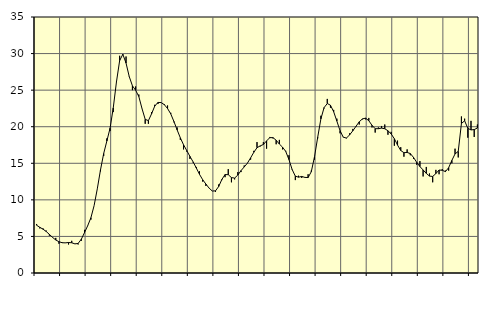
| Category | Piggar | Series 1 |
|---|---|---|
| nan | 6.7 | 6.53 |
| 87.0 | 6.1 | 6.25 |
| 87.0 | 6.1 | 5.99 |
| 87.0 | 5.8 | 5.68 |
| nan | 5.1 | 5.28 |
| 88.0 | 4.9 | 4.87 |
| 88.0 | 4.8 | 4.51 |
| 88.0 | 4 | 4.28 |
| nan | 4.2 | 4.14 |
| 89.0 | 4.1 | 4.12 |
| 89.0 | 3.9 | 4.17 |
| 89.0 | 4.4 | 4.13 |
| nan | 4 | 3.98 |
| 90.0 | 3.9 | 4.04 |
| 90.0 | 4.4 | 4.62 |
| 90.0 | 5.9 | 5.52 |
| nan | 6.5 | 6.47 |
| 91.0 | 7.3 | 7.55 |
| 91.0 | 9.2 | 9.2 |
| 91.0 | 11.5 | 11.5 |
| nan | 13.9 | 14.08 |
| 92.0 | 16 | 16.33 |
| 92.0 | 18.4 | 18.05 |
| 92.0 | 19.4 | 19.8 |
| nan | 22 | 22.57 |
| 93.0 | 26.2 | 26.13 |
| 93.0 | 29.7 | 29.04 |
| 93.0 | 29.8 | 29.9 |
| nan | 29.6 | 28.7 |
| 94.0 | 26.9 | 26.86 |
| 94.0 | 25 | 25.59 |
| 94.0 | 25.5 | 24.99 |
| nan | 24.4 | 24.13 |
| 95.0 | 22.5 | 22.48 |
| 95.0 | 20.4 | 21.01 |
| 95.0 | 20.4 | 20.83 |
| nan | 22 | 21.77 |
| 96.0 | 23 | 22.83 |
| 96.0 | 23.1 | 23.32 |
| 96.0 | 23.3 | 23.3 |
| nan | 23.1 | 23.01 |
| 97.0 | 22.9 | 22.49 |
| 97.0 | 21.9 | 21.75 |
| 97.0 | 20.6 | 20.71 |
| nan | 19.9 | 19.56 |
| 98.0 | 18.2 | 18.48 |
| 98.0 | 16.9 | 17.53 |
| 98.0 | 16.6 | 16.75 |
| nan | 15.6 | 15.95 |
| 99.0 | 15.1 | 15.19 |
| 99.0 | 14.5 | 14.36 |
| 99.0 | 13.9 | 13.49 |
| nan | 12.5 | 12.75 |
| 0.0 | 11.9 | 12.16 |
| 0.0 | 11.6 | 11.61 |
| 0.0 | 11.2 | 11.21 |
| nan | 11.1 | 11.23 |
| 1.0 | 12.1 | 11.82 |
| 1.0 | 12.7 | 12.79 |
| 1.0 | 13.1 | 13.46 |
| nan | 14.2 | 13.44 |
| 2.0 | 12.4 | 13.04 |
| 2.0 | 12.8 | 12.98 |
| 2.0 | 13.8 | 13.39 |
| nan | 13.8 | 14 |
| 3.0 | 14.7 | 14.5 |
| 3.0 | 15 | 15.02 |
| 3.0 | 15.5 | 15.74 |
| nan | 16.7 | 16.5 |
| 4.0 | 17.9 | 17.13 |
| 4.0 | 17.3 | 17.38 |
| 4.0 | 17.9 | 17.57 |
| nan | 17 | 18.06 |
| 5.0 | 18.6 | 18.5 |
| 5.0 | 18.4 | 18.51 |
| 5.0 | 17.6 | 18.15 |
| nan | 18.2 | 17.63 |
| 6.0 | 16.9 | 17.2 |
| 6.0 | 16.7 | 16.62 |
| 6.0 | 16.1 | 15.51 |
| nan | 14.2 | 14.15 |
| 7.0 | 12.7 | 13.24 |
| 7.0 | 13.3 | 13.1 |
| 7.0 | 13 | 13.2 |
| nan | 13.1 | 13.07 |
| 8.0 | 13.5 | 13.05 |
| 8.0 | 14 | 13.85 |
| 8.0 | 15.5 | 15.88 |
| nan | 18.4 | 18.55 |
| 9.0 | 21.5 | 21.07 |
| 9.0 | 22.5 | 22.61 |
| 9.0 | 23.8 | 23.17 |
| nan | 22.6 | 22.94 |
| 10.0 | 22.3 | 22.05 |
| 10.0 | 21.1 | 20.77 |
| 10.0 | 19.1 | 19.46 |
| nan | 18.6 | 18.57 |
| 11.0 | 18.4 | 18.45 |
| 11.0 | 19.1 | 18.89 |
| 11.0 | 19.7 | 19.44 |
| nan | 20 | 20.06 |
| 12.0 | 20.3 | 20.67 |
| 12.0 | 21 | 21.07 |
| 12.0 | 21 | 21.17 |
| nan | 21.2 | 20.82 |
| 13.0 | 19.9 | 20.19 |
| 13.0 | 19.2 | 19.73 |
| 13.0 | 19.9 | 19.73 |
| nan | 20.1 | 19.81 |
| 14.0 | 20.3 | 19.72 |
| 14.0 | 18.9 | 19.45 |
| 14.0 | 19.3 | 19.01 |
| nan | 17.4 | 18.36 |
| 15.0 | 18.1 | 17.49 |
| 15.0 | 17.2 | 16.75 |
| 15.0 | 15.9 | 16.45 |
| nan | 16.9 | 16.48 |
| 16.0 | 16.1 | 16.33 |
| 16.0 | 15.6 | 15.8 |
| 16.0 | 14.8 | 15.13 |
| nan | 15.3 | 14.55 |
| 17.0 | 13.2 | 14.09 |
| 17.0 | 14.5 | 13.62 |
| 17.0 | 13.6 | 13.25 |
| nan | 12.4 | 13.2 |
| 18.0 | 14.1 | 13.59 |
| 18.0 | 13.5 | 14.08 |
| 18.0 | 14.2 | 14.04 |
| nan | 14 | 13.86 |
| 19.0 | 14 | 14.4 |
| 19.0 | 15 | 15.39 |
| 19.0 | 17 | 16.28 |
| nan | 15.8 | 16.63 |
| 20.0 | 21.4 | 20.44 |
| 20.0 | 21.1 | 20.81 |
| 20.0 | 18.5 | 19.78 |
| nan | 20.8 | 19.56 |
| 21.0 | 18.6 | 19.61 |
| 21.0 | 20.3 | 19.82 |